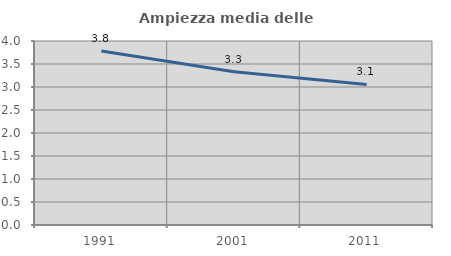
| Category | Ampiezza media delle famiglie |
|---|---|
| 1991.0 | 3.783 |
| 2001.0 | 3.332 |
| 2011.0 | 3.055 |